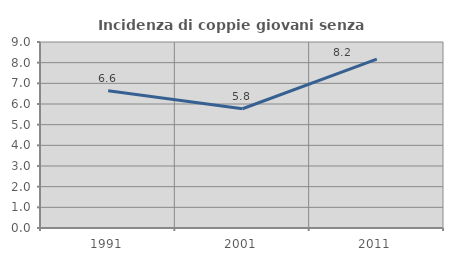
| Category | Incidenza di coppie giovani senza figli |
|---|---|
| 1991.0 | 6.637 |
| 2001.0 | 5.771 |
| 2011.0 | 8.172 |